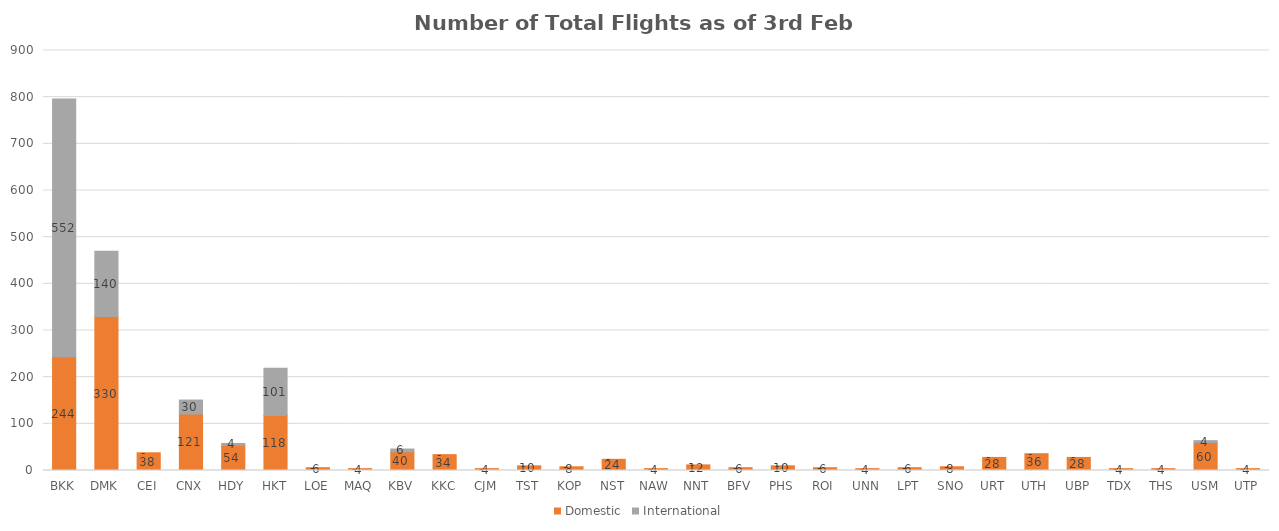
| Category | Domestic | International |
|---|---|---|
| BKK | 244 | 552 |
| DMK | 330 | 140 |
| CEI | 38 | 0 |
| CNX | 121 | 30 |
| HDY | 54 | 4 |
| HKT | 118 | 101 |
| LOE | 6 | 0 |
| MAQ | 4 | 0 |
| KBV | 40 | 6 |
| KKC | 34 | 0 |
| CJM | 4 | 0 |
| TST | 10 | 0 |
| KOP | 8 | 0 |
| NST | 24 | 0 |
| NAW | 4 | 0 |
| NNT | 12 | 0 |
| BFV | 6 | 0 |
| PHS | 10 | 0 |
| ROI | 6 | 0 |
| UNN | 4 | 0 |
| LPT | 6 | 0 |
| SNO | 8 | 0 |
| URT | 28 | 0 |
| UTH | 36 | 0 |
| UBP | 28 | 0 |
| TDX | 4 | 0 |
| THS | 4 | 0 |
| USM | 60 | 4 |
| UTP | 4 | 0 |